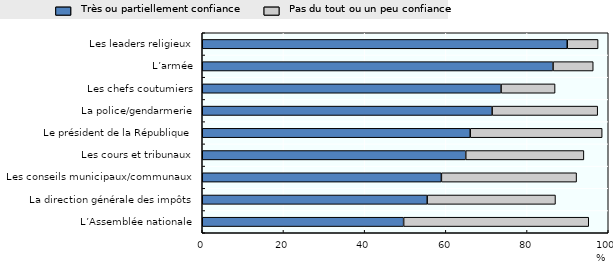
| Category | Très ou partiellement confiance | Pas du tout ou un peu confiance |
|---|---|---|
| L’Assemblée nationale | 49.6 | 45.6 |
| La direction générale des impôts | 55.4 | 31.6 |
| Les conseils municipaux/communaux | 58.9 | 33.3 |
| Les cours et tribunaux | 64.9 | 29.1 |
| Le président de la République | 66 | 32.5 |
| La police/gendarmerie | 71.4 | 26 |
| Les chefs coutumiers | 73.6 | 13.3 |
| L’armée | 86.4 | 9.9 |
| Les leaders religieux | 89.9 | 7.6 |